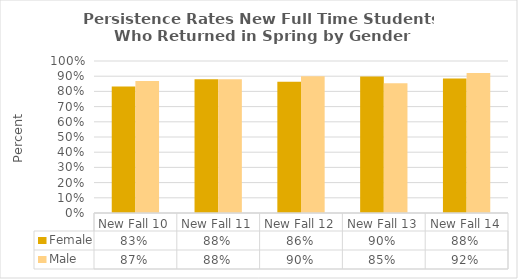
| Category | Female | Male |
|---|---|---|
| New Fall 10 | 0.832 | 0.868 |
| New Fall 11 | 0.88 | 0.88 |
| New Fall 12 | 0.863 | 0.9 |
| New Fall 13 | 0.898 | 0.853 |
| New Fall 14 | 0.885 | 0.921 |